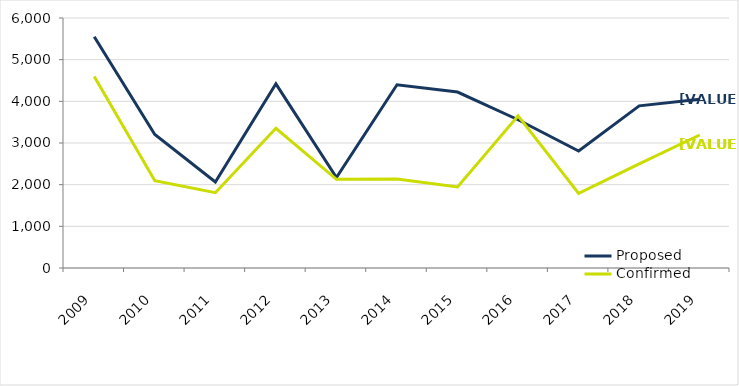
| Category | Proposed | Confirmed |
|---|---|---|
| 2009 | 5548 | 4596 |
| 2010 | 3205 | 2096 |
| 2011 | 2064 | 1808 |
| 2012 | 4420 | 3353 |
| 2013 | 2172 | 2129 |
| 2014 | 4397 | 2136 |
| 2015 | 4222 | 1946 |
| 2016 | 3558 | 3653 |
| 2017 | 2807 | 1790 |
| 2018 | 3891 | 2498 |
| 2019 | 4048 | 3192 |